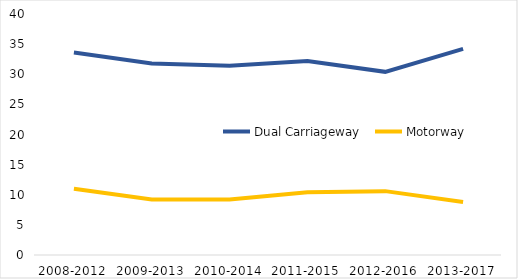
| Category | Dual Carriageway | Motorway |
|---|---|---|
| 2008-2012 | 33.6 | 11 |
| 2009-2013 | 31.8 | 9.2 |
| 2010-2014 | 31.4 | 9.2 |
| 2011-2015 | 32.2 | 10.4 |
| 2012-2016 | 30.4 | 10.6 |
| 2013-2017 | 34.2 | 8.8 |